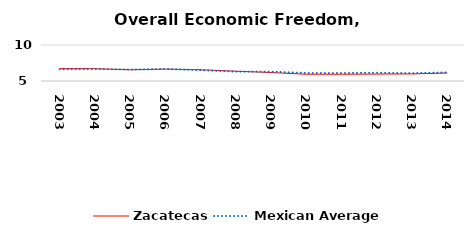
| Category | Zacatecas | Mexican Average  |
|---|---|---|
| 2003.0 | 6.719 | 6.632 |
| 2004.0 | 6.706 | 6.678 |
| 2005.0 | 6.56 | 6.582 |
| 2006.0 | 6.653 | 6.668 |
| 2007.0 | 6.56 | 6.508 |
| 2008.0 | 6.359 | 6.3 |
| 2009.0 | 6.175 | 6.3 |
| 2010.0 | 5.942 | 6.105 |
| 2011.0 | 5.939 | 6.103 |
| 2012.0 | 5.965 | 6.144 |
| 2013.0 | 5.987 | 6.087 |
| 2014.0 | 6.107 | 6.195 |